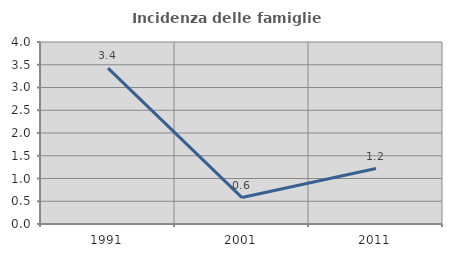
| Category | Incidenza delle famiglie numerose |
|---|---|
| 1991.0 | 3.425 |
| 2001.0 | 0.581 |
| 2011.0 | 1.22 |